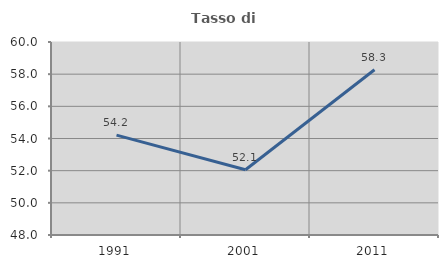
| Category | Tasso di occupazione   |
|---|---|
| 1991.0 | 54.212 |
| 2001.0 | 52.06 |
| 2011.0 | 58.273 |